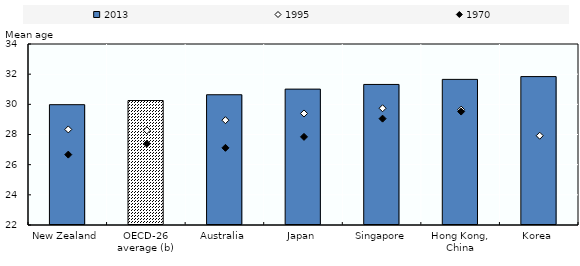
| Category | 2013 |
|---|---|
| New Zealand | 29.977 |
| OECD-26 average (b) | 30.253 |
| Australia | 30.636 |
| Japan | 31.009 |
| Singapore | 31.318 |
| Hong Kong, China | 31.655 |
| Korea | 31.84 |